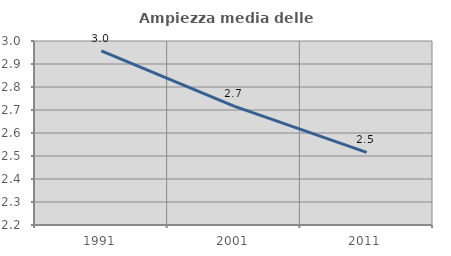
| Category | Ampiezza media delle famiglie |
|---|---|
| 1991.0 | 2.957 |
| 2001.0 | 2.717 |
| 2011.0 | 2.516 |